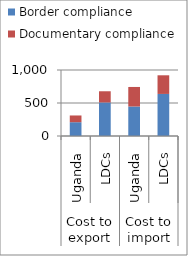
| Category | Border compliance | Documentary compliance |
|---|---|---|
| 0 | 209 | 102 |
| 1 | 508.368 | 169.477 |
| 2 | 447 | 296 |
| 3 | 637.341 | 282.386 |